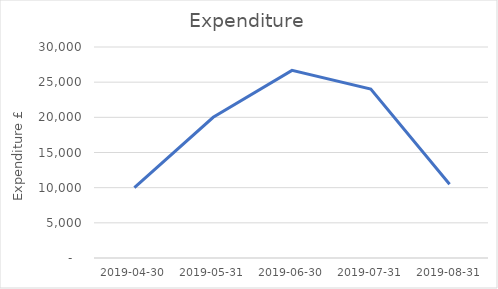
| Category | Total |
|---|---|
| 2019-04-30 | 10000 |
| 2019-05-31 | 20000 |
| 2019-06-30 | 26672.61 |
| 2019-07-31 | 24029.8 |
| 2019-08-31 | 10491.6 |